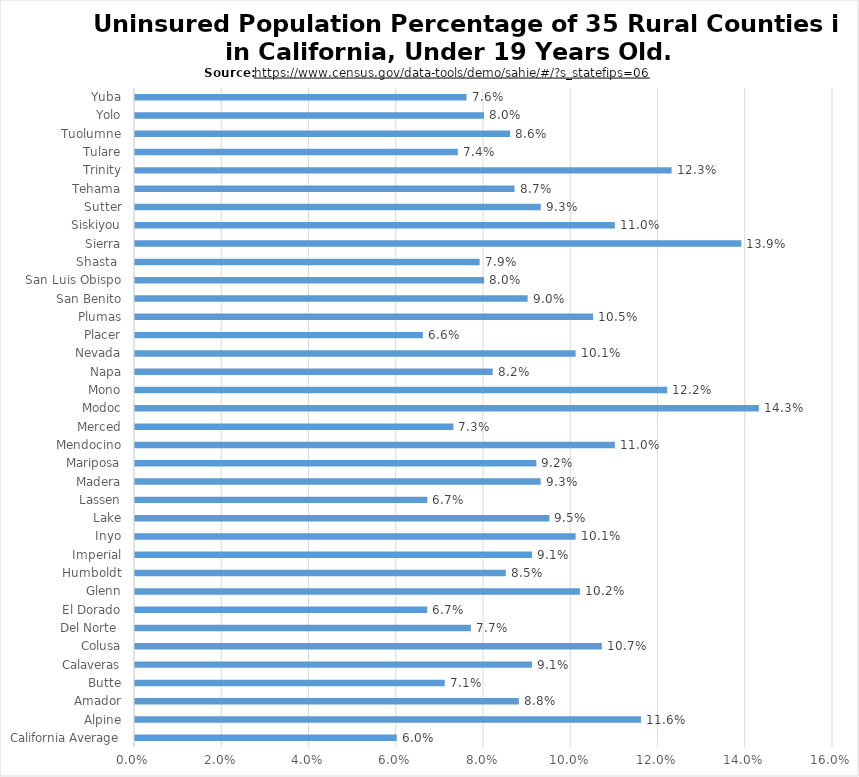
| Category | Series 0 |
|---|---|
| California Average | 0.06 |
| Alpine | 0.116 |
| Amador | 0.088 |
| Butte | 0.071 |
| Calaveras | 0.091 |
| Colusa | 0.107 |
| Del Norte  | 0.077 |
| El Dorado | 0.067 |
| Glenn | 0.102 |
| Humboldt | 0.085 |
| Imperial | 0.091 |
| Inyo | 0.101 |
| Lake | 0.095 |
| Lassen | 0.067 |
| Madera | 0.093 |
| Mariposa | 0.092 |
| Mendocino | 0.11 |
| Merced | 0.073 |
| Modoc | 0.143 |
| Mono | 0.122 |
| Napa | 0.082 |
| Nevada | 0.101 |
| Placer | 0.066 |
| Plumas | 0.105 |
| San Benito | 0.09 |
| San Luis Obispo | 0.08 |
| Shasta  | 0.079 |
| Sierra | 0.139 |
| Siskiyou | 0.11 |
| Sutter | 0.093 |
| Tehama | 0.087 |
| Trinity | 0.123 |
| Tulare | 0.074 |
| Tuolumne | 0.086 |
| Yolo | 0.08 |
| Yuba | 0.076 |